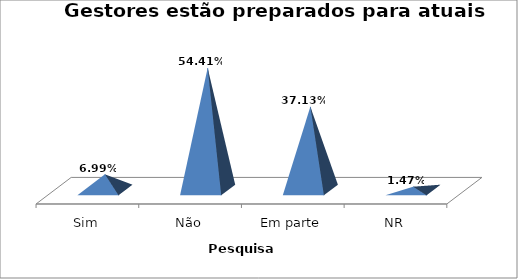
| Category | % |
|---|---|
| Sim | 0.07 |
| Não | 0.544 |
| Em parte | 0.371 |
| NR | 0.015 |